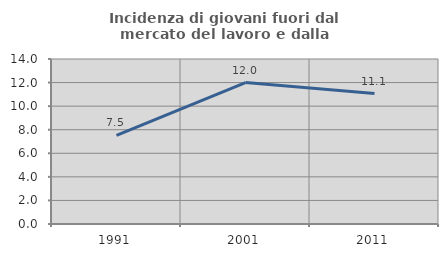
| Category | Incidenza di giovani fuori dal mercato del lavoro e dalla formazione  |
|---|---|
| 1991.0 | 7.511 |
| 2001.0 | 12 |
| 2011.0 | 11.068 |